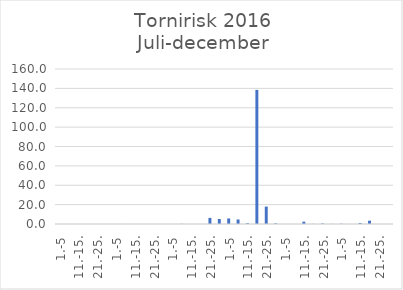
| Category | Series 0 |
|---|---|
| 1.-5 | 0 |
| 6.-10. | 0 |
| 11.-15. | 0 |
| 16.-20. | 0 |
| 21.-25. | 0 |
| 26.-31. | 0 |
| 1.-5 | 0 |
| 6.-10. | 0.037 |
| 11.-15. | 0 |
| 16.-20. | 0 |
| 21.-25. | 0 |
| 26.-31. | 0 |
| 1.-5 | 0 |
| 6.-10. | 0.174 |
| 11.-15. | 0 |
| 16.-20. | 0 |
| 21.-25. | 6.301 |
| 26.-30. | 5.14 |
| 1.-5 | 5.709 |
| 6.-10. | 4.65 |
| 11.-15. | 0.823 |
| 16.-20. | 138.432 |
| 21.-25. | 17.974 |
| 26.-31. | 0.647 |
| 1.-5 | 0 |
| 6.-10. | 0 |
| 11.-15. | 2.405 |
| 16.-20. | 0.151 |
| 21.-25. | 0.549 |
| 26.-30. | 0.1 |
| 1.-5 | 0.278 |
| 6.-10. | 0 |
| 11.-15. | 1.004 |
| 16.-20. | 3.424 |
| 21.-25. | 0 |
| 26.-31. | 0 |